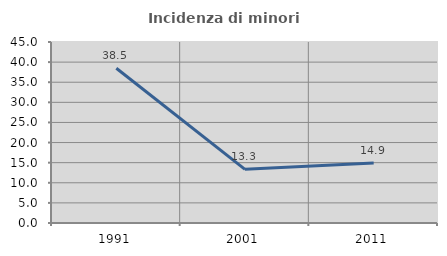
| Category | Incidenza di minori stranieri |
|---|---|
| 1991.0 | 38.462 |
| 2001.0 | 13.333 |
| 2011.0 | 14.904 |